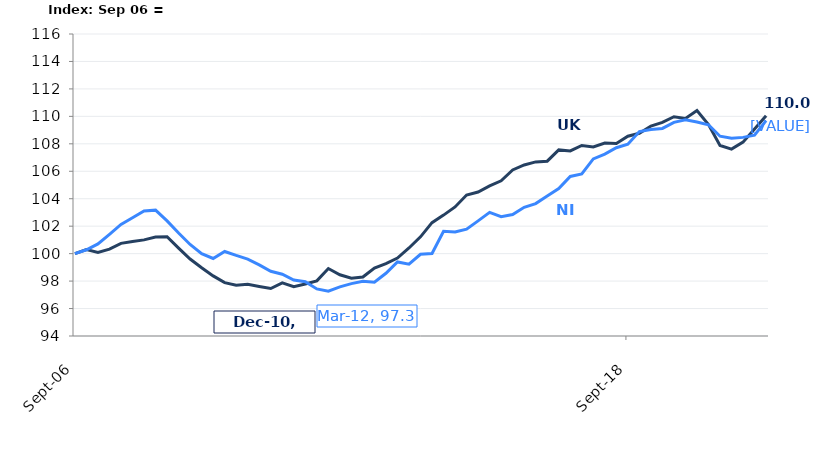
| Category | UK |
|---|---|
| 2006-09-01 | 100 |
| 2006-12-01 | 100.293 |
| 2007-03-01 | 100.093 |
| 2007-06-01 | 100.332 |
| 2007-09-01 | 100.749 |
| 2007-12-01 | 100.885 |
| 2008-03-01 | 101.003 |
| 2008-06-01 | 101.21 |
| 2008-09-01 | 101.231 |
| 2008-12-01 | 100.4 |
| 2009-03-01 | 99.604 |
| 2009-06-01 | 98.976 |
| 2009-09-01 | 98.38 |
| 2009-12-01 | 97.891 |
| 2010-03-01 | 97.698 |
| 2010-06-01 | 97.769 |
| 2010-09-01 | 97.612 |
| 2010-12-01 | 97.459 |
| 2011-03-01 | 97.876 |
| 2011-06-01 | 97.587 |
| 2011-09-01 | 97.791 |
| 2011-12-01 | 98.016 |
| 2012-03-01 | 98.915 |
| 2012-06-01 | 98.458 |
| 2012-09-01 | 98.205 |
| 2012-12-01 | 98.294 |
| 2013-03-01 | 98.951 |
| 2013-06-01 | 99.279 |
| 2013-09-01 | 99.679 |
| 2013-12-01 | 100.41 |
| 2014-03-01 | 101.224 |
| 2014-06-01 | 102.256 |
| 2014-09-01 | 102.805 |
| 2014-12-01 | 103.401 |
| 2015-03-01 | 104.269 |
| 2015-06-01 | 104.486 |
| 2015-09-01 | 104.932 |
| 2015-12-01 | 105.307 |
| 2016-03-01 | 106.096 |
| 2016-06-01 | 106.46 |
| 2016-09-01 | 106.681 |
| 2016-12-01 | 106.735 |
| 2017-03-01 | 107.556 |
| 2017-06-01 | 107.481 |
| 2017-09-01 | 107.877 |
| 2017-12-01 | 107.773 |
| 2018-03-01 | 108.052 |
| 2018-06-01 | 108.023 |
| 2018-09-01 | 108.551 |
| 2018-12-01 | 108.765 |
| 2019-03-01 | 109.294 |
| 2019-06-01 | 109.558 |
| 2019-09-01 | 109.975 |
| 2019-12-01 | 109.843 |
| 2020-03-01 | 110.418 |
| 2020-06-01 | 109.401 |
| 2020-09-01 | 107.88 |
| 2020-12-01 | 107.613 |
| 2021-03-01 | 108.123 |
| 2021-06-01 | 109.083 |
| 2021-09-01 | 110.043 |